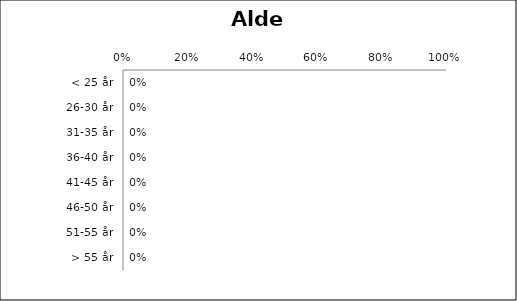
| Category | Alder (Udfylder) |
|---|---|
| < 25 år | 0 |
| 26-30 år | 0 |
| 31-35 år | 0 |
| 36-40 år | 0 |
| 41-45 år | 0 |
| 46-50 år | 0 |
| 51-55 år | 0 |
| > 55 år | 0 |